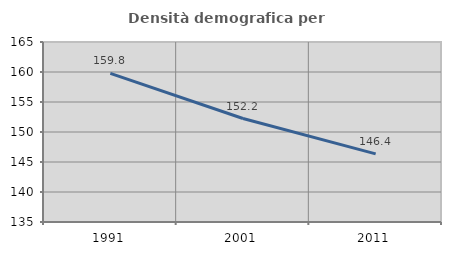
| Category | Densità demografica |
|---|---|
| 1991.0 | 159.771 |
| 2001.0 | 152.247 |
| 2011.0 | 146.361 |